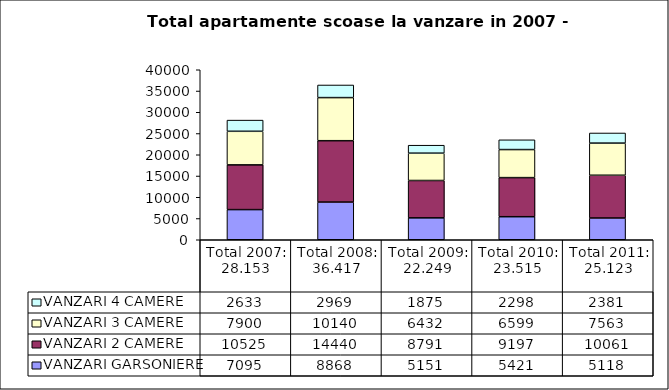
| Category | VANZARI GARSONIERE | VANZARI 2 CAMERE | VANZARI 3 CAMERE | VANZARI 4 CAMERE |
|---|---|---|---|---|
| Total 2007: 28.153 | 7095 | 10525 | 7900 | 2633 |
| Total 2008: 36.417 | 8868 | 14440 | 10140 | 2969 |
| Total 2009: 22.249 | 5151 | 8791 | 6432 | 1875 |
| Total 2010: 23.515 | 5421 | 9197 | 6599 | 2298 |
| Total 2011: 25.123 | 5118 | 10061 | 7563 | 2381 |